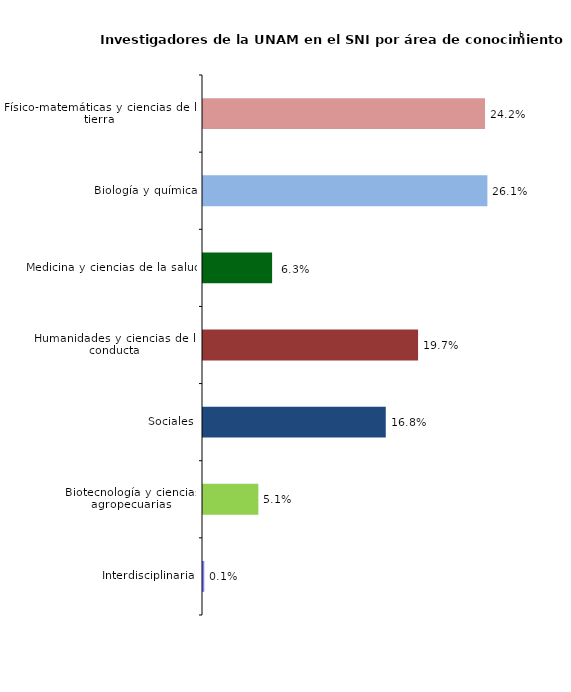
| Category | Series 0 |
|---|---|
| Interdisciplinaria | 0.001 |
| Biotecnología y ciencias agropecuarias | 0.051 |
| Sociales | 0.168 |
| Humanidades y ciencias de la conducta | 0.197 |
| Medicina y ciencias de la salud | 0.063 |
| Biología y química | 0.261 |
| Físico-matemáticas y ciencias de la tierra | 0.259 |